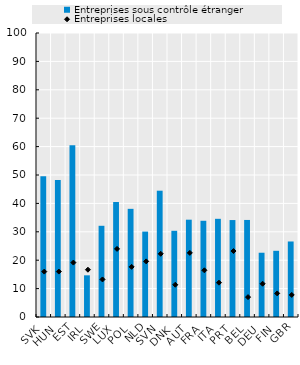
| Category | Entreprises sous contrôle étranger |
|---|---|
| SVK | 49.602 |
| HUN | 48.227 |
| EST | 60.465 |
| IRL | 14.674 |
| SWE | 32.116 |
| LUX | 40.484 |
| POL | 38.085 |
| NLD | 30.076 |
| SVN | 44.472 |
| DNK | 30.354 |
| AUT | 34.265 |
| FRA | 33.884 |
| ITA | 34.573 |
| PRT | 34.137 |
| BEL | 34.172 |
| DEU | 22.63 |
| FIN | 23.309 |
| GBR | 26.59 |